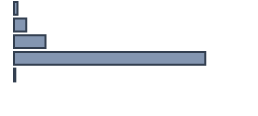
| Category | Percentatge |
|---|---|
| 0 | 1.509 |
| 1 | 5.075 |
| 2 | 13.169 |
| 3 | 79.698 |
| 4 | 0.549 |
| 5 | 0 |